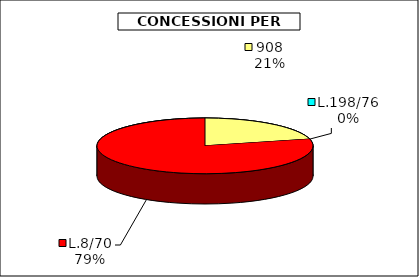
| Category | Series 0 |
|---|---|
| 908 | 38556.625 |
| L.198/76 | 0 |
| L.8/70 | 144182.5 |